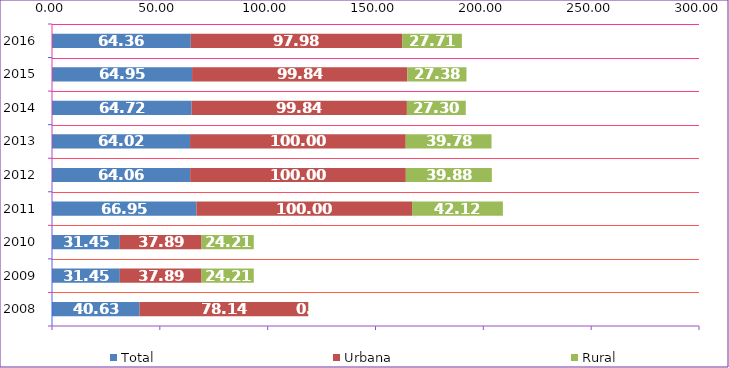
| Category | Total | Urbana | Rural |
|---|---|---|---|
| 2008.0 | 40.63 | 78.14 | 0.14 |
| 2009.0 | 31.45 | 37.89 | 24.21 |
| 2010.0 | 31.45 | 37.89 | 24.21 |
| 2011.0 | 66.95 | 100 | 42.12 |
| 2012.0 | 64.06 | 100 | 39.88 |
| 2013.0 | 64.02 | 100 | 39.78 |
| 2014.0 | 64.72 | 99.84 | 27.3 |
| 2015.0 | 64.95 | 99.84 | 27.38 |
| 2016.0 | 64.36 | 97.98 | 27.71 |